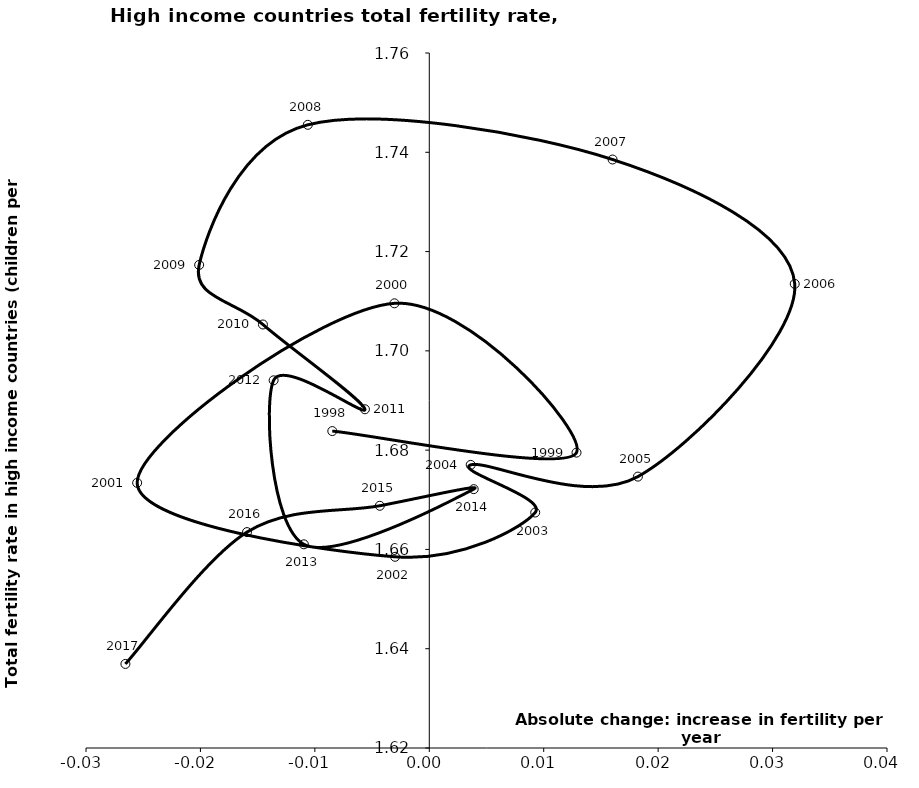
| Category | Series 0 |
|---|---|
| -0.008476688517392028 | 1.684 |
| 0.012867769513589034 | 1.68 |
| -0.0030437542662042905 | 1.71 |
| -0.02553026584292728 | 1.673 |
| -0.0029903101218875516 | 1.659 |
| 0.00925762392235785 | 1.667 |
| 0.0036183415376805916 | 1.677 |
| 0.0182325513110958 | 1.675 |
| 0.03193733706737545 | 1.713 |
| 0.016018964853989903 | 1.739 |
| -0.010616571675200248 | 1.746 |
| -0.020110939149198814 | 1.717 |
| -0.01453812596084969 | 1.705 |
| -0.005622638726543228 | 1.688 |
| -0.013602745674119343 | 1.694 |
| -0.010961412192869613 | 1.661 |
| 0.0038828321959962775 | 1.672 |
| -0.004325707386618971 | 1.669 |
| -0.01592959500366664 | 1.663 |
| -0.02655614381494309 | 1.637 |